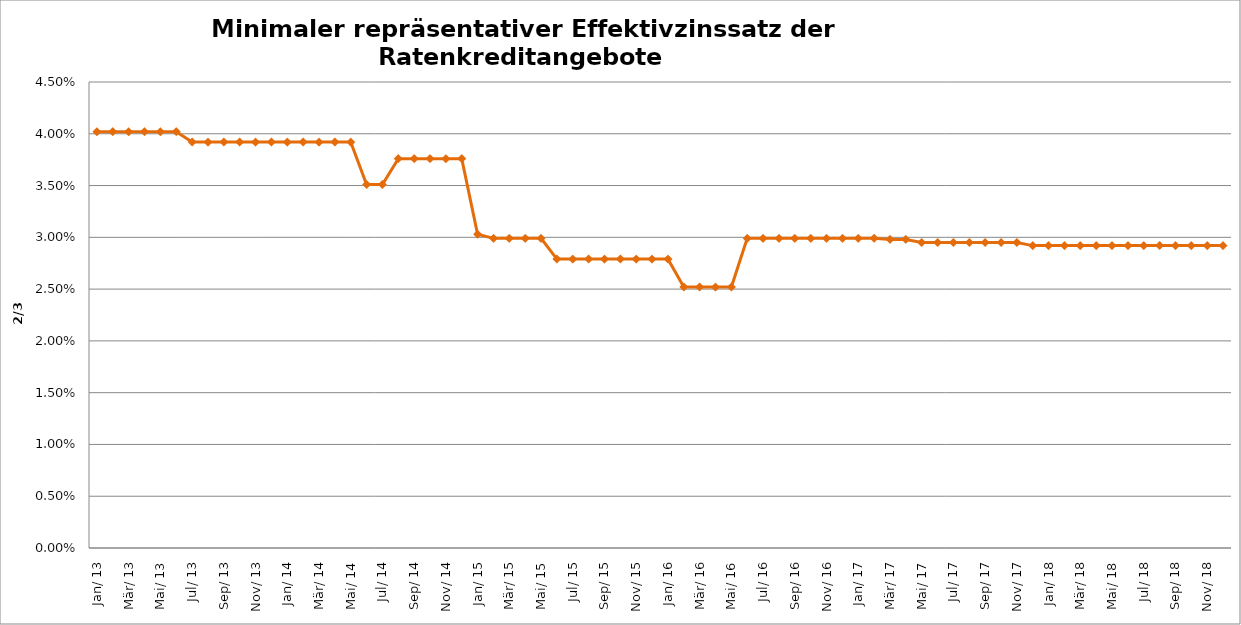
| Category | Series 0 |
|---|---|
| 2013-01-01 | 0.04 |
| 2013-02-01 | 0.04 |
| 2013-03-01 | 0.04 |
| 2013-04-01 | 0.04 |
| 2013-05-01 | 0.04 |
| 2013-06-01 | 0.04 |
| 2013-07-01 | 0.039 |
| 2013-08-01 | 0.039 |
| 2013-09-01 | 0.039 |
| 2013-10-01 | 0.039 |
| 2013-11-01 | 0.039 |
| 2013-12-01 | 0.039 |
| 2014-01-01 | 0.039 |
| 2014-02-01 | 0.039 |
| 2014-03-01 | 0.039 |
| 2014-04-01 | 0.039 |
| 2014-05-01 | 0.039 |
| 2014-06-01 | 0.035 |
| 2014-07-01 | 0.035 |
| 2014-08-01 | 0.038 |
| 2014-09-01 | 0.038 |
| 2014-10-01 | 0.038 |
| 2014-11-01 | 0.038 |
| 2014-12-01 | 0.038 |
| 2015-01-01 | 0.03 |
| 2015-02-01 | 0.03 |
| 2015-03-01 | 0.03 |
| 2015-04-01 | 0.03 |
| 2015-05-01 | 0.03 |
| 2015-06-01 | 0.028 |
| 2015-07-01 | 0.028 |
| 2015-08-01 | 0.028 |
| 2015-09-01 | 0.028 |
| 2015-10-01 | 0.028 |
| 2015-11-01 | 0.028 |
| 2015-12-01 | 0.028 |
| 2016-01-01 | 0.028 |
| 2016-02-01 | 0.025 |
| 2016-03-01 | 0.025 |
| 2016-04-01 | 0.025 |
| 2016-05-01 | 0.025 |
| 2016-06-01 | 0.03 |
| 2016-07-01 | 0.03 |
| 2016-08-01 | 0.03 |
| 2016-09-01 | 0.03 |
| 2016-10-01 | 0.03 |
| 2016-11-01 | 0.03 |
| 2016-12-01 | 0.03 |
| 2017-01-01 | 0.03 |
| 2017-02-01 | 0.03 |
| 2017-03-01 | 0.03 |
| 2017-04-01 | 0.03 |
| 2017-05-01 | 0.03 |
| 2017-06-01 | 0.03 |
| 2017-07-01 | 0.03 |
| 2017-08-01 | 0.03 |
| 2017-09-01 | 0.03 |
| 2017-10-01 | 0.03 |
| 2017-11-01 | 0.03 |
| 2017-12-01 | 0.029 |
| 2018-01-01 | 0.029 |
| 2018-02-01 | 0.029 |
| 2018-03-01 | 0.029 |
| 2018-04-01 | 0.029 |
| 2018-05-01 | 0.029 |
| 2018-06-01 | 0.029 |
| 2018-07-01 | 0.029 |
| 2018-08-01 | 0.029 |
| 2018-09-01 | 0.029 |
| 2018-10-01 | 0.029 |
| 2018-11-01 | 0.029 |
| 2018-12-01 | 0.029 |